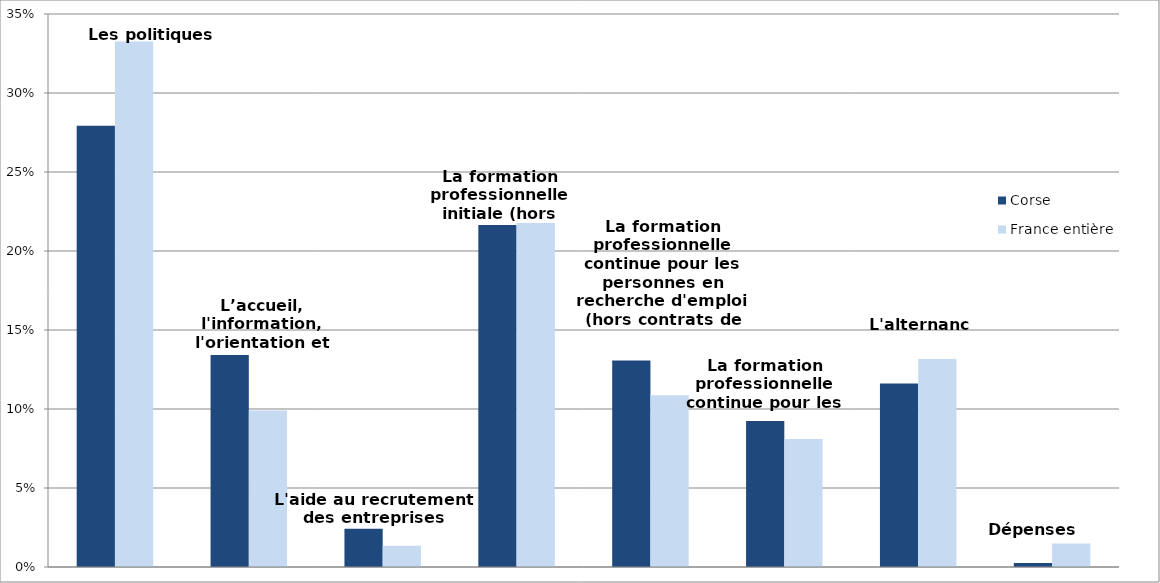
| Category | Corse | France entière |
|---|---|---|
| Les politiques d'emploi | 0.279 | 0.333 |
| L’accueil, l'information, l'orientation et l'accompagnement | 0.134 | 0.099 |
| L'aide au recrutement des entreprises | 0.024 | 0.013 |
| La formation professionnelle initiale (hors apprentissage) | 0.216 | 0.218 |
| La formation professionnelle continue pour les personnes en recherche d'emploi (hors contrats de professionnalisation) | 0.131 | 0.109 |
| La formation professionnelle continue pour les actifs occupés | 0.092 | 0.081 |
| L'alternance | 0.116 | 0.132 |
| Dépenses non-ventilables | 0.003 | 0.015 |